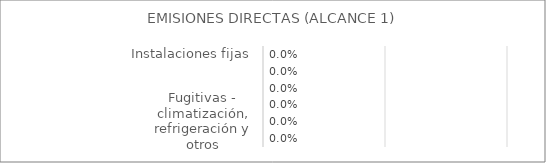
| Category | Series 0 |
|---|---|
| Instalaciones fijas | 0 |
| Transporte por carretera | 0 |
| Transporte ferroviario, marítimo y aéreo | 0 |
| Funcionamiento de maquinaria | 0 |
| Fugitivas - climatización, refrigeración y otros | 0 |
| Proceso | 0 |